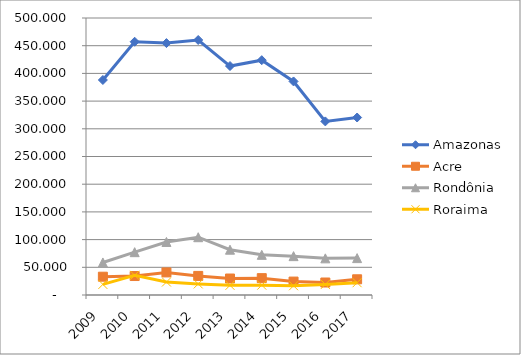
| Category | Amazonas | Acre | Rondônia | Roraima |
|---|---|---|---|---|
| 2009.0 | 388.094 | 33 | 58.735 | 19.101 |
| 2010.0 | 457.15 | 34.242 | 77.329 | 35.577 |
| 2011.0 | 454.732 | 40.775 | 95.738 | 23.409 |
| 2012.0 | 460.309 | 34.445 | 104.321 | 19.989 |
| 2013.0 | 413.286 | 29.749 | 81.776 | 17.492 |
| 2014.0 | 423.859 | 30.431 | 72.504 | 17.805 |
| 2015.0 | 385.478 | 24.222 | 70.152 | 16.703 |
| 2016.0 | 313.332 | 22.538 | 66.162 | 19.119 |
| 2017.0 | 320.377 | 28.355 | 66.568 | 22.222 |